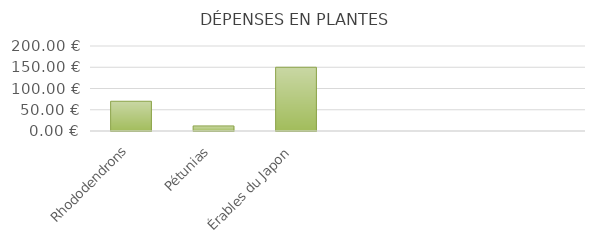
| Category | Rhododendrons |
|---|---|
| Rhododendrons | 70 |
| Pétunias | 11.94 |
| Érables du Japon | 150 |